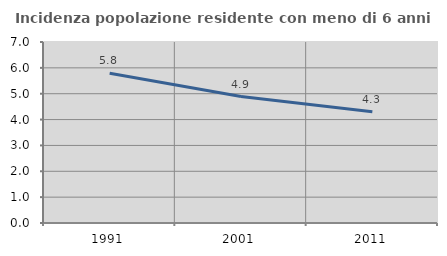
| Category | Incidenza popolazione residente con meno di 6 anni |
|---|---|
| 1991.0 | 5.788 |
| 2001.0 | 4.891 |
| 2011.0 | 4.3 |